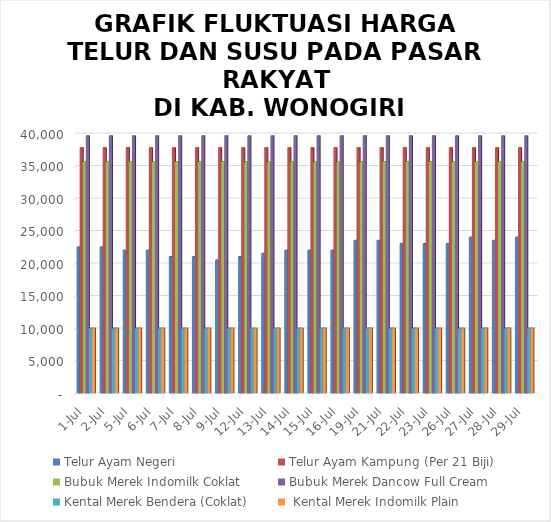
| Category | Telur Ayam Negeri | Telur Ayam Kampung (Per 21 Biji) | Bubuk Merek Indomilk Coklat | Bubuk Merek Dancow Full Cream | Kental Merek Bendera (Coklat) |  Kental Merek Indomilk Plain |
|---|---|---|---|---|---|---|
| 2021-07-01 | 22500 | 37800 | 35600 | 39600 | 10000 | 10000 |
| 2021-07-02 | 22500 | 37800 | 35600 | 39600 | 10000 | 10000 |
| 2021-07-05 | 22000 | 37800 | 35600 | 39600 | 10000 | 10000 |
| 2021-07-06 | 22000 | 37800 | 35600 | 39600 | 10000 | 10000 |
| 2021-07-07 | 21000 | 37800 | 35600 | 39600 | 10000 | 10000 |
| 2021-07-08 | 21000 | 37800 | 35600 | 39600 | 10000 | 10000 |
| 2021-07-09 | 20500 | 37800 | 35600 | 39600 | 10000 | 10000 |
| 2021-07-12 | 21000 | 37800 | 35600 | 39600 | 10000 | 10000 |
| 2021-07-13 | 21500 | 37800 | 35600 | 39600 | 10000 | 10000 |
| 2021-07-14 | 22000 | 37800 | 35600 | 39600 | 10000 | 10000 |
| 2021-07-15 | 22000 | 37800 | 35600 | 39600 | 10000 | 10000 |
| 2021-07-16 | 22000 | 37800 | 35600 | 39600 | 10000 | 10000 |
| 2021-07-19 | 23500 | 37800 | 35600 | 39600 | 10000 | 10000 |
| 2021-07-21 | 23500 | 37800 | 35600 | 39600 | 10000 | 10000 |
| 2021-07-22 | 23000 | 37800 | 35600 | 39600 | 10000 | 10000 |
| 2021-07-23 | 23000 | 37800 | 35600 | 39600 | 10000 | 10000 |
| 2021-07-26 | 23000 | 37800 | 35600 | 39600 | 10000 | 10000 |
| 2021-07-27 | 24000 | 37800 | 35600 | 39600 | 10000 | 10000 |
| 2021-07-28 | 23500 | 37800 | 35600 | 39600 | 10000 | 10000 |
| 2021-07-29 | 24000 | 37800 | 35600 | 39600 | 10000 | 10000 |